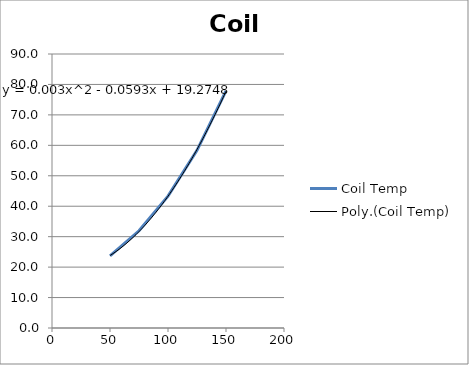
| Category | Coil Temp |
|---|---|
| 50.0 | 23.663 |
| 75.0 | 31.927 |
| 100.0 | 43.301 |
| 125.0 | 58.37 |
| 150.0 | 77.888 |